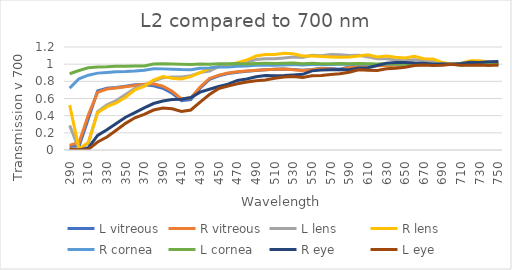
| Category | L vitreous | R vitreous | L lens | R lens | R cornea | L cornea | R eye | L eye |
|---|---|---|---|---|---|---|---|---|
| 290.0 | 0.051 | 0.056 | 0.287 | 0.522 | 0.721 | 0.888 | 0.01 | 0.015 |
| 300.0 | 0.041 | 0.084 | 0.009 | 0.016 | 0.83 | 0.926 | 0.001 | 0.002 |
| 310.0 | 0.365 | 0.409 | 0.077 | 0.087 | 0.872 | 0.958 | 0.023 | 0.007 |
| 320.0 | 0.688 | 0.672 | 0.446 | 0.434 | 0.896 | 0.968 | 0.169 | 0.093 |
| 330.0 | 0.721 | 0.711 | 0.526 | 0.504 | 0.904 | 0.97 | 0.235 | 0.151 |
| 340.0 | 0.729 | 0.722 | 0.576 | 0.549 | 0.911 | 0.974 | 0.31 | 0.23 |
| 350.0 | 0.744 | 0.736 | 0.648 | 0.614 | 0.914 | 0.975 | 0.382 | 0.31 |
| 360.0 | 0.76 | 0.752 | 0.717 | 0.702 | 0.921 | 0.978 | 0.434 | 0.375 |
| 370.0 | 0.759 | 0.765 | 0.752 | 0.742 | 0.93 | 0.979 | 0.49 | 0.415 |
| 380.0 | 0.749 | 0.771 | 0.804 | 0.815 | 0.947 | 1.002 | 0.541 | 0.465 |
| 390.0 | 0.72 | 0.743 | 0.841 | 0.856 | 0.945 | 1.004 | 0.57 | 0.49 |
| 400.0 | 0.662 | 0.684 | 0.85 | 0.837 | 0.941 | 1.002 | 0.589 | 0.48 |
| 410.0 | 0.575 | 0.596 | 0.851 | 0.827 | 0.936 | 0.999 | 0.591 | 0.45 |
| 420.0 | 0.588 | 0.607 | 0.865 | 0.855 | 0.935 | 0.995 | 0.612 | 0.466 |
| 430.0 | 0.72 | 0.733 | 0.901 | 0.902 | 0.953 | 1.003 | 0.674 | 0.558 |
| 440.0 | 0.823 | 0.834 | 0.92 | 0.951 | 0.956 | 1 | 0.707 | 0.647 |
| 450.0 | 0.865 | 0.873 | 0.971 | 0.973 | 0.969 | 1.006 | 0.74 | 0.717 |
| 460.0 | 0.89 | 0.897 | 0.99 | 0.987 | 0.968 | 1.004 | 0.768 | 0.744 |
| 470.0 | 0.906 | 0.911 | 1.009 | 1.018 | 0.976 | 1.006 | 0.811 | 0.772 |
| 480.0 | 0.917 | 0.921 | 1.022 | 1.048 | 0.977 | 1.002 | 0.828 | 0.791 |
| 490.0 | 0.926 | 0.929 | 1.055 | 1.095 | 0.987 | 1.009 | 0.852 | 0.806 |
| 500.0 | 0.935 | 0.934 | 1.063 | 1.111 | 0.989 | 1.009 | 0.868 | 0.816 |
| 510.0 | 0.941 | 0.94 | 1.064 | 1.114 | 0.988 | 1.008 | 0.866 | 0.835 |
| 520.0 | 0.944 | 0.943 | 1.073 | 1.126 | 0.991 | 1.012 | 0.867 | 0.85 |
| 530.0 | 0.938 | 0.936 | 1.083 | 1.122 | 0.995 | 1.014 | 0.875 | 0.857 |
| 540.0 | 0.93 | 0.926 | 1.079 | 1.095 | 0.989 | 1.004 | 0.882 | 0.844 |
| 550.0 | 0.937 | 0.934 | 1.104 | 1.095 | 0.997 | 1.009 | 0.922 | 0.864 |
| 560.0 | 0.952 | 0.948 | 1.098 | 1.09 | 0.995 | 1.006 | 0.933 | 0.867 |
| 570.0 | 0.949 | 0.943 | 1.111 | 1.084 | 0.996 | 1.004 | 0.936 | 0.88 |
| 580.0 | 0.94 | 0.936 | 1.111 | 1.079 | 1 | 1.007 | 0.938 | 0.888 |
| 590.0 | 0.967 | 0.962 | 1.1 | 1.084 | 0.998 | 1.005 | 0.934 | 0.907 |
| 600.0 | 0.981 | 0.977 | 1.103 | 1.095 | 1.002 | 1.007 | 0.955 | 0.935 |
| 610.0 | 0.985 | 0.982 | 1.085 | 1.11 | 0.999 | 1.006 | 0.958 | 0.93 |
| 620.0 | 0.985 | 0.98 | 1.063 | 1.084 | 0.996 | 1.002 | 0.984 | 0.926 |
| 630.0 | 0.989 | 0.985 | 1.063 | 1.094 | 1.002 | 1.005 | 1.012 | 0.946 |
| 640.0 | 0.989 | 0.986 | 1.05 | 1.081 | 1.002 | 1.001 | 1.02 | 0.953 |
| 650.0 | 0.992 | 0.989 | 1.044 | 1.072 | 1.003 | 0.998 | 1.02 | 0.964 |
| 660.0 | 0.994 | 0.991 | 1.05 | 1.093 | 1.004 | 1.004 | 1.012 | 0.985 |
| 670.0 | 0.996 | 0.994 | 1.039 | 1.063 | 1.004 | 1.001 | 1.01 | 0.989 |
| 680.0 | 0.997 | 0.995 | 1.031 | 1.06 | 1.002 | 0.999 | 0.998 | 0.984 |
| 690.0 | 0.999 | 0.997 | 1.013 | 1.018 | 1.001 | 0.995 | 1.003 | 0.989 |
| 700.0 | 1 | 1 | 1 | 1 | 1 | 1 | 1 | 1 |
| 710.0 | 1.001 | 0.999 | 0.991 | 1.012 | 1 | 0.991 | 1.008 | 0.986 |
| 720.0 | 1 | 0.999 | 1.032 | 1.039 | 1.006 | 0.997 | 1.023 | 0.987 |
| 730.0 | 0.998 | 0.998 | 1.021 | 1.041 | 1.005 | 0.994 | 1.021 | 0.989 |
| 740.0 | 0.997 | 0.997 | 0.995 | 1.022 | 1.008 | 0.996 | 1.029 | 0.983 |
| 750.0 | 0.997 | 0.998 | 0.983 | 1.02 | 1.011 | 0.998 | 1.03 | 0.993 |